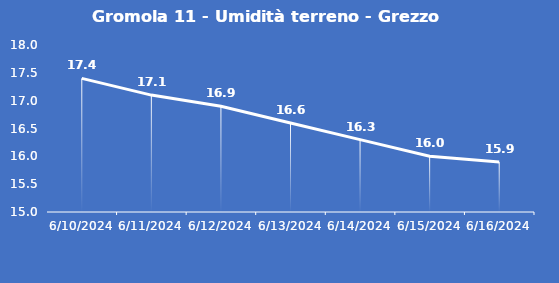
| Category | Gromola 11 - Umidità terreno - Grezzo (%VWC) |
|---|---|
| 6/10/24 | 17.4 |
| 6/11/24 | 17.1 |
| 6/12/24 | 16.9 |
| 6/13/24 | 16.6 |
| 6/14/24 | 16.3 |
| 6/15/24 | 16 |
| 6/16/24 | 15.9 |